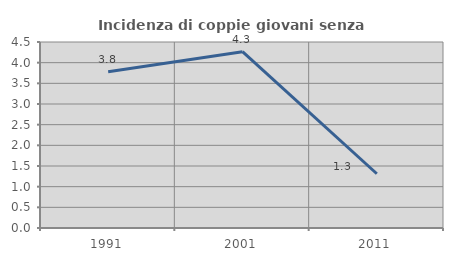
| Category | Incidenza di coppie giovani senza figli |
|---|---|
| 1991.0 | 3.778 |
| 2001.0 | 4.265 |
| 2011.0 | 1.312 |